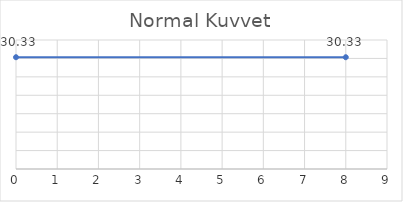
| Category | Series 0 |
|---|---|
| 0.0 | 30.328 |
| 8.0 | 30.328 |